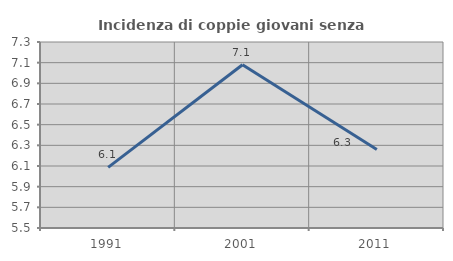
| Category | Incidenza di coppie giovani senza figli |
|---|---|
| 1991.0 | 6.087 |
| 2001.0 | 7.08 |
| 2011.0 | 6.26 |